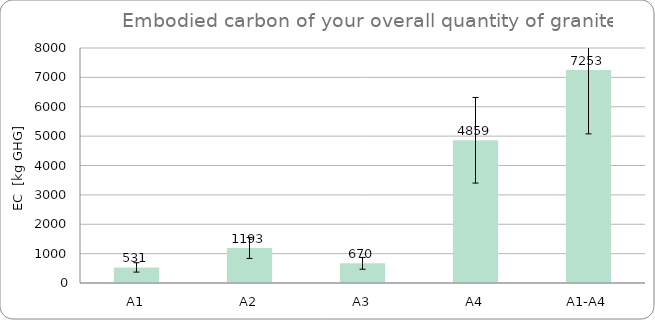
| Category | Series 0 |
|---|---|
| A1 | 531 |
| A2 | 1193.2 |
| A3 | 670 |
| A4 | 4858.8 |
| A1-A4 | 7253 |